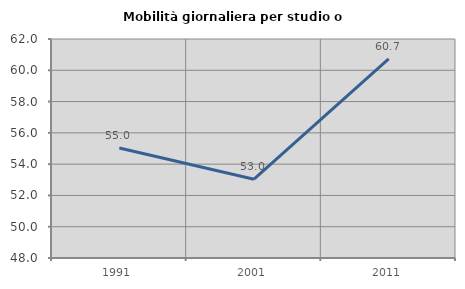
| Category | Mobilità giornaliera per studio o lavoro |
|---|---|
| 1991.0 | 55.031 |
| 2001.0 | 53.035 |
| 2011.0 | 60.735 |